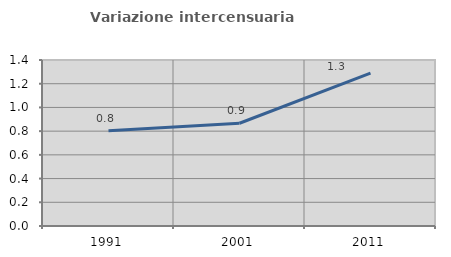
| Category | Variazione intercensuaria annua |
|---|---|
| 1991.0 | 0.804 |
| 2001.0 | 0.867 |
| 2011.0 | 1.289 |